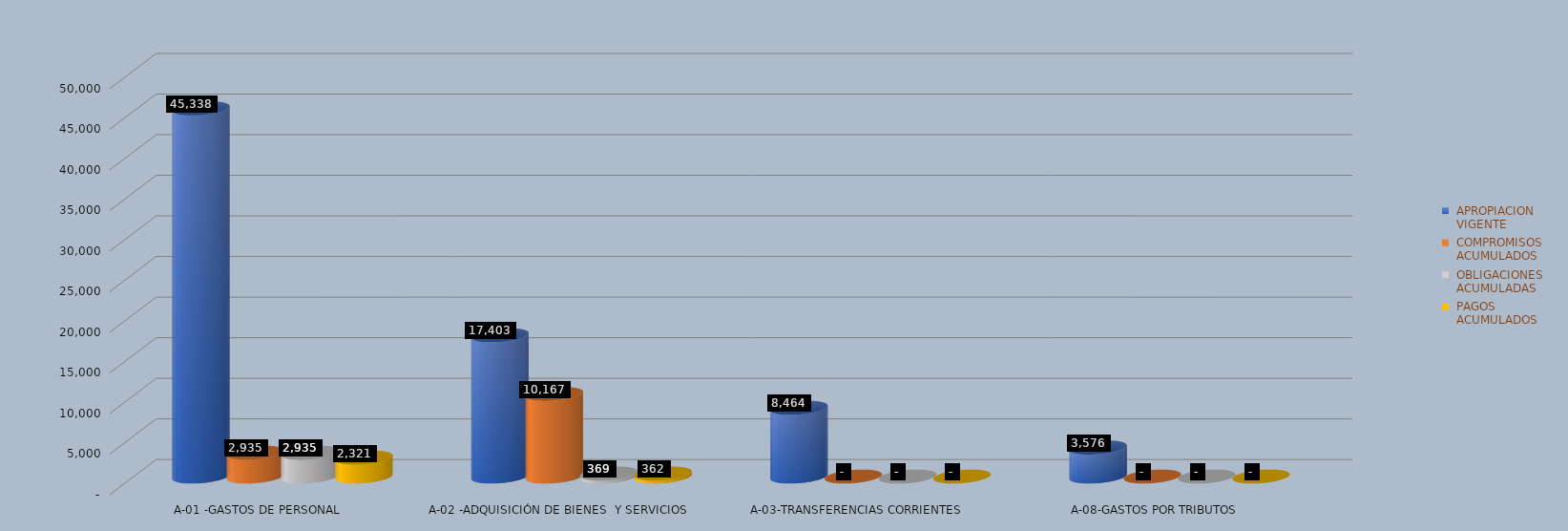
| Category |  APROPIACION
 VIGENTE |  COMPROMISOS
 ACUMULADOS |  OBLIGACIONES
 ACUMULADAS |  PAGOS
 ACUMULADOS |
|---|---|---|---|---|
| A-01 -GASTOS DE PERSONAL | 45338 | 2934.501 | 2934.501 | 2320.623 |
| A-02 -ADQUISICIÓN DE BIENES  Y SERVICIOS | 17402.665 | 10167.306 | 368.687 | 362.387 |
| A-03-TRANSFERENCIAS CORRIENTES | 8464 | 0 | 0 | 0 |
| A-08-GASTOS POR TRIBUTOS, MULTAS, SANCIONES E INTERESES DE MORA | 3576 | 0 | 0 | 0 |